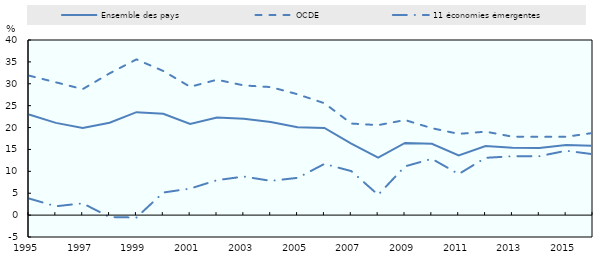
| Category | Ensemble des pays | OCDE | 11 économies émergentes |
|---|---|---|---|
| 1995.0 | 22.986 | 31.862 | 3.793 |
| 1996.0 | 21.066 | 30.332 | 2.02 |
| 1997.0 | 19.93 | 28.78 | 2.689 |
| 1998.0 | 21.117 | 32.379 | -0.446 |
| 1999.0 | 23.518 | 35.567 | -0.55 |
| 2000.0 | 23.154 | 32.921 | 5.156 |
| 2001.0 | 20.841 | 29.308 | 6.059 |
| 2002.0 | 22.27 | 30.928 | 7.981 |
| 2003.0 | 22.021 | 29.622 | 8.808 |
| 2004.0 | 21.262 | 29.246 | 7.827 |
| 2005.0 | 20.059 | 27.609 | 8.511 |
| 2006.0 | 19.913 | 25.558 | 11.695 |
| 2007.0 | 16.323 | 20.918 | 10.054 |
| 2008.0 | 13.106 | 20.556 | 4.629 |
| 2009.0 | 16.491 | 21.718 | 11.131 |
| 2010.0 | 16.286 | 19.856 | 12.86 |
| 2011.0 | 13.652 | 18.552 | 9.384 |
| 2012.0 | 15.771 | 19.068 | 13.086 |
| 2013.0 | 15.374 | 17.919 | 13.443 |
| 2014.0 | 15.318 | 17.878 | 13.458 |
| 2015.0 | 15.987 | 17.893 | 14.706 |
| 2016.0 | 15.818 | 18.771 | 13.91 |